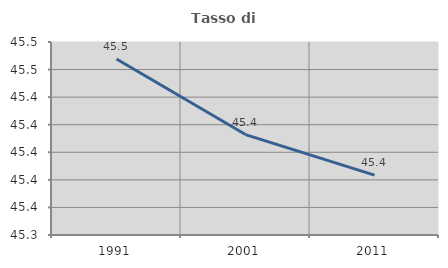
| Category | Tasso di occupazione   |
|---|---|
| 1991.0 | 45.468 |
| 2001.0 | 45.413 |
| 2011.0 | 45.383 |